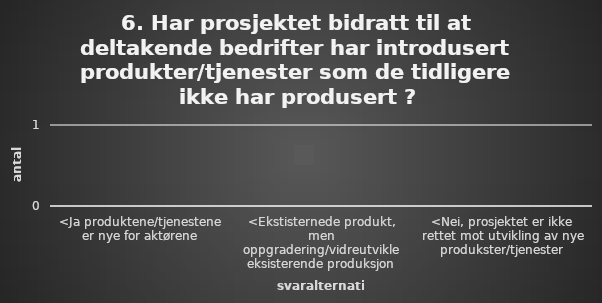
| Category | Series 0 |
|---|---|
| <Ja produktene/tjenestene er nye for aktørene | 0 |
| <Ekstisternede produkt, men oppgradering/vidreutvikle eksisterende produksjon | 0 |
| <Nei, prosjektet er ikke rettet mot utvikling av nye produkster/tjenester | 0 |